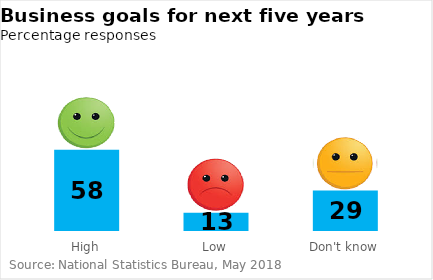
| Category | Business goals for next five years | Icon |
|---|---|---|
| High | 58 | 40 |
| Low | 13 | 40 |
| Don't know | 29 | 40 |